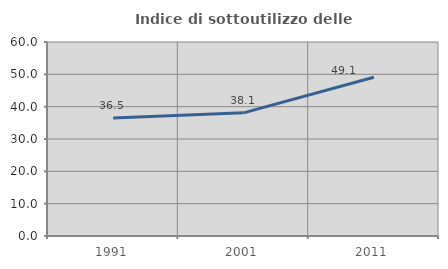
| Category | Indice di sottoutilizzo delle abitazioni  |
|---|---|
| 1991.0 | 36.458 |
| 2001.0 | 38.095 |
| 2011.0 | 49.104 |